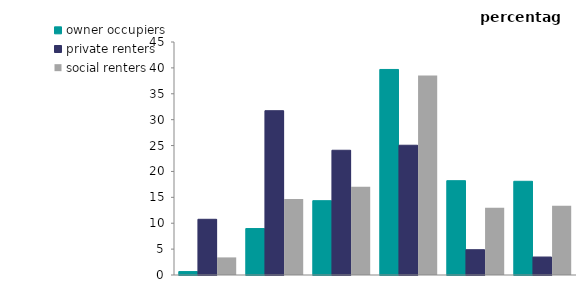
| Category | owner occupiers | private renters | social renters |
|---|---|---|---|
| 16-24 | 0.663 | 10.759 | 3.398 |
| 25-34 | 8.974 | 31.733 | 14.663 |
| 35-44 | 14.354 | 24.093 | 17.06 |
| 45-64 | 39.695 | 25.059 | 38.521 |
| 65-74 | 18.216 | 4.885 | 12.969 |
| 75 or over | 18.098 | 3.47 | 13.389 |